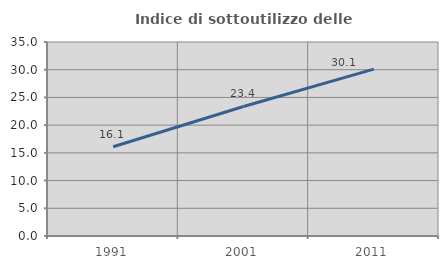
| Category | Indice di sottoutilizzo delle abitazioni  |
|---|---|
| 1991.0 | 16.092 |
| 2001.0 | 23.364 |
| 2011.0 | 30.114 |